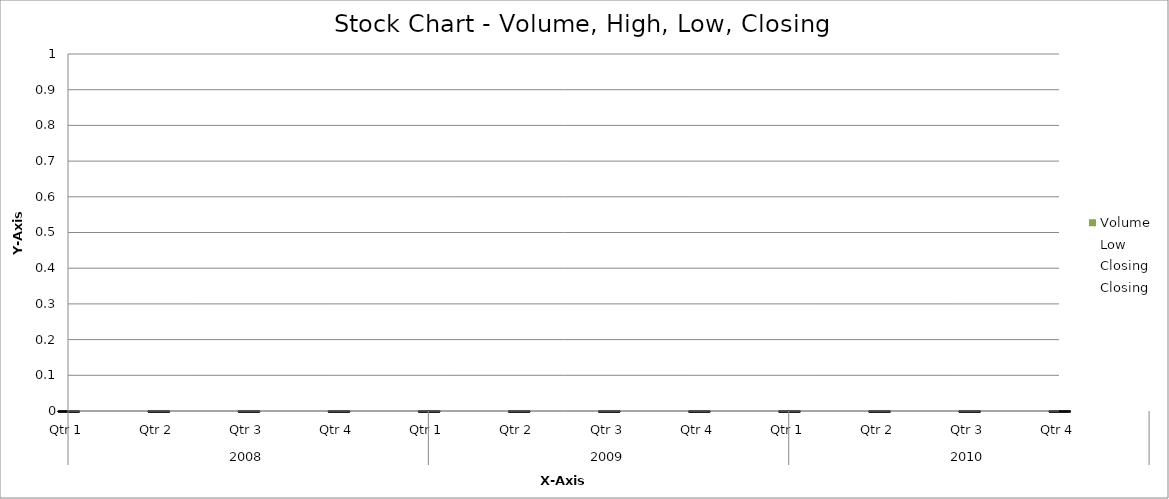
| Category | Volume |
|---|---|
| 0 | 121 |
| 1 | 140 |
| 2 | 147 |
| 3 | 144 |
| 4 | 133 |
| 5 | 126 |
| 6 | 147 |
| 7 | 141 |
| 8 | 135 |
| 9 | 123 |
| 10 | 139 |
| 11 | 149 |